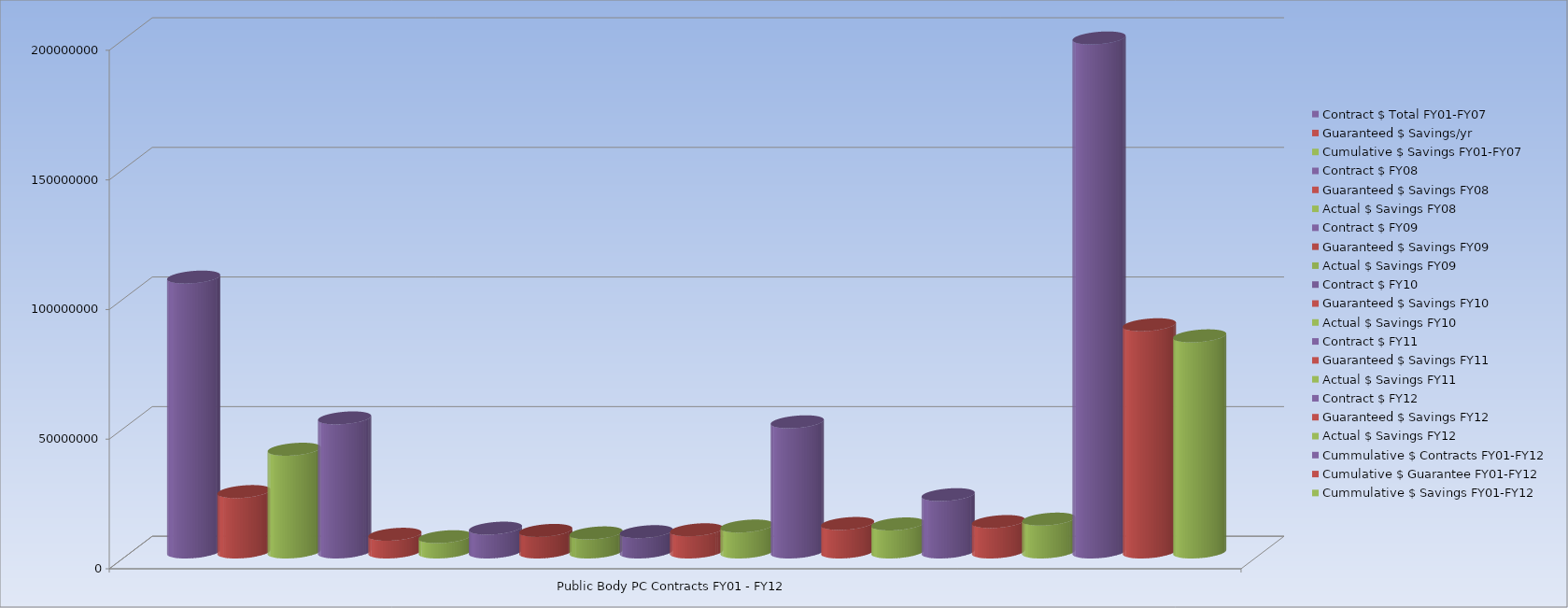
| Category | Contract $ Total FY01-FY07 | Guaranteed $ Savings/yr | Cumulative $ Savings FY01-FY07 | Contract $ FY08 | Guaranteed $ Savings FY08 | Actual $ Savings FY08 | Contract $ FY09 | Guaranteed $ Savings FY09 | Actual $ Savings FY09 | Contract $ FY10 | Guaranteed $ Savings FY10 | Actual $ Savings FY10 | Contract $ FY11 | Guaranteed $ Savings FY11 | Actual $ Savings FY11 | Contract $ FY12 | Guaranteed $ Savings FY12 | Actual $ Savings FY12 | Cummulative $ Contracts FY01-FY12 | Cumulative $ Guarantee FY01-FY12 | Cummulative $ Savings FY01-FY12 |
|---|---|---|---|---|---|---|---|---|---|---|---|---|---|---|---|---|---|---|---|---|---|
| Public Body PC Contracts FY01 - FY12 | 106036139 | 23298572 | 39629634 | 51717450 | 6823897 | 5889667.18 | 9185987 | 8314089.19 | 7359117.21 | 7840262 | 8564561.19 | 9994009.928 | 50207548 | 10980504.721 | 10806463.029 | 22101546 | 11730697.35 | 12674670.029 | 198279442.11 | 87646959.551 | 83371646.734 |